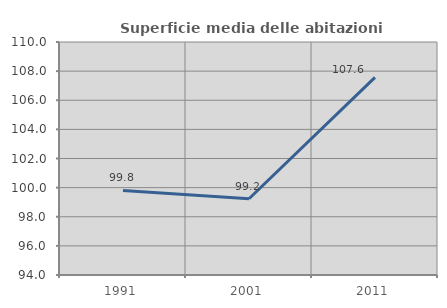
| Category | Superficie media delle abitazioni occupate |
|---|---|
| 1991.0 | 99.804 |
| 2001.0 | 99.235 |
| 2011.0 | 107.575 |